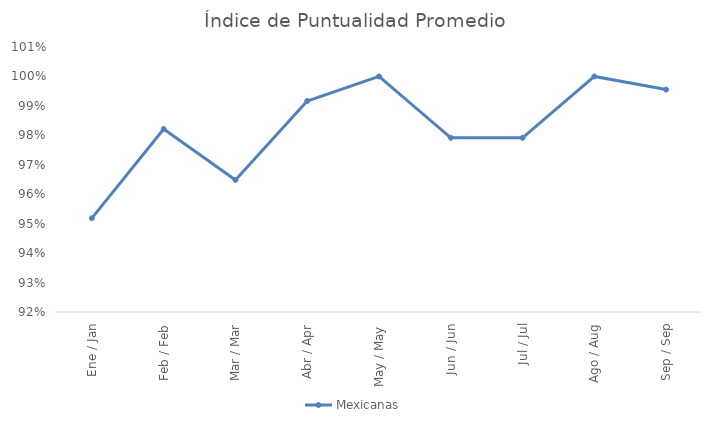
| Category | Mexicanas |
|---|---|
| Ene / Jan | 0.952 |
| Feb / Feb | 0.982 |
| Mar / Mar | 0.965 |
| Abr / Apr | 0.992 |
| May / May | 1 |
| Jun / Jun | 0.979 |
| Jul / Jul | 0.979 |
| Ago / Aug | 1 |
| Sep / Sep | 0.996 |